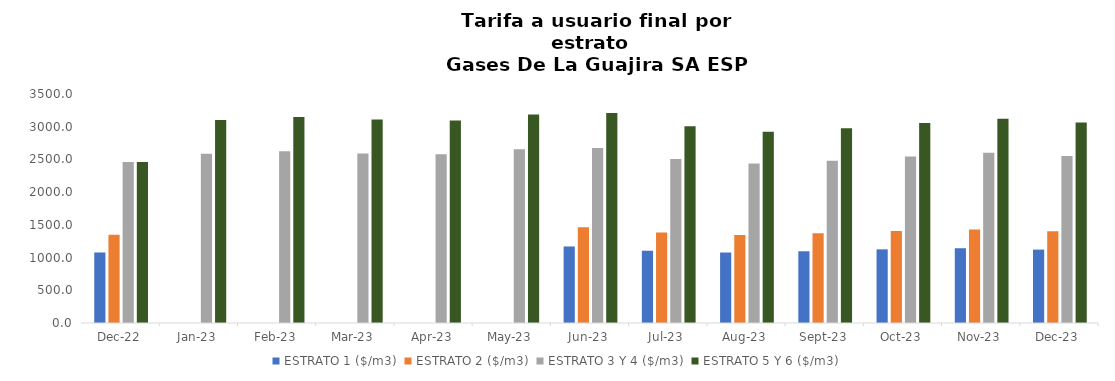
| Category | ESTRATO 1 ($/m3) | ESTRATO 2 ($/m3) | ESTRATO 3 Y 4 ($/m3) | ESTRATO 5 Y 6 ($/m3) |
|---|---|---|---|---|
| 2022-12-01 | 1077.8 | 1346.96 | 2461.97 | 2461.97 |
| 2023-01-01 | 0 | 0 | 2586.67 | 3104.004 |
| 2023-02-01 | 0 | 0 | 2623.2 | 3147.84 |
| 2023-03-01 | 0 | 0 | 2590.74 | 3108.888 |
| 2023-04-01 | 0 | 0 | 2580.05 | 3096.06 |
| 2023-05-01 | 0 | 0 | 2656.89 | 3188.268 |
| 2023-06-01 | 1169.58 | 1461.63 | 2673.91 | 3208.692 |
| 2023-07-01 | 1106 | 1382.28 | 2506.8 | 3008.16 |
| 2023-08-01 | 1077.22 | 1345.91 | 2436.6 | 2923.92 |
| 2023-09-01 | 1096.44 | 1370.32 | 2481.1 | 2977.32 |
| 2023-10-01 | 1125.72 | 1407.25 | 2546.63 | 3055.956 |
| 2023-11-01 | 1142.78 | 1427.17 | 2601.21 | 3121.452 |
| 2023-12-01 | 1121.82 | 1401.58 | 2553.75 | 3064.5 |